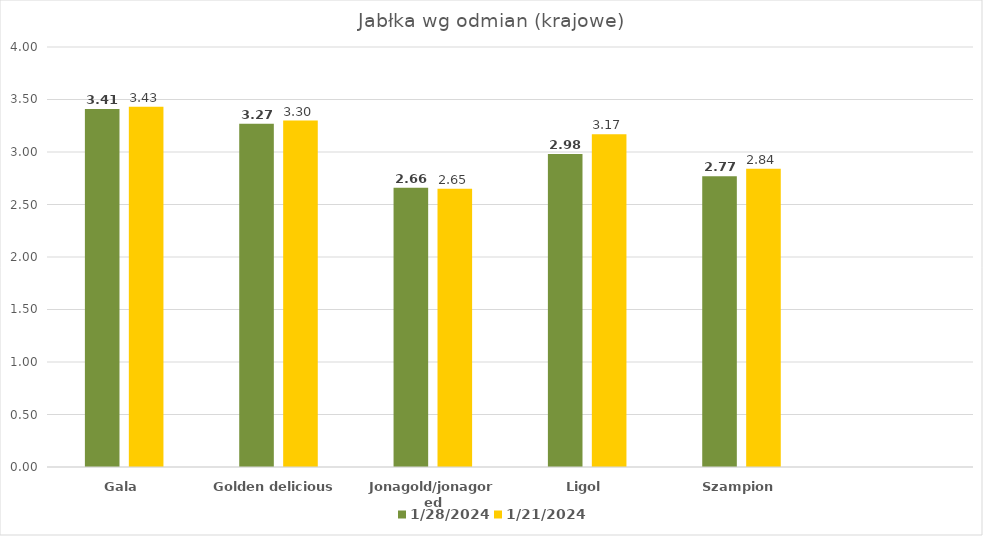
| Category | 28.01.2024 | 21.01.2024 |
|---|---|---|
| Gala | 3.41 | 3.43 |
| Golden delicious | 3.27 | 3.3 |
| Jonagold/jonagored | 2.66 | 2.65 |
| Ligol | 2.98 | 3.17 |
| Szampion | 2.77 | 2.84 |